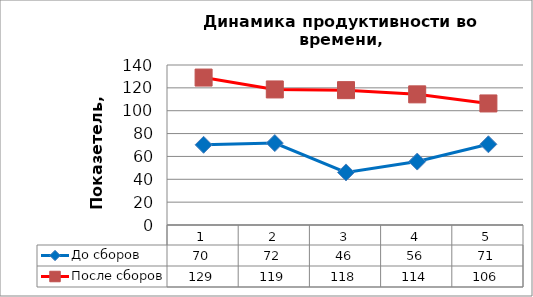
| Category | До сборов | После сборов |
|---|---|---|
| 0 | 70.154 | 129 |
| 1 | 71.682 | 118.609 |
| 2 | 46 | 118 |
| 3 | 55.5 | 114.312 |
| 4 | 70.636 | 106.364 |